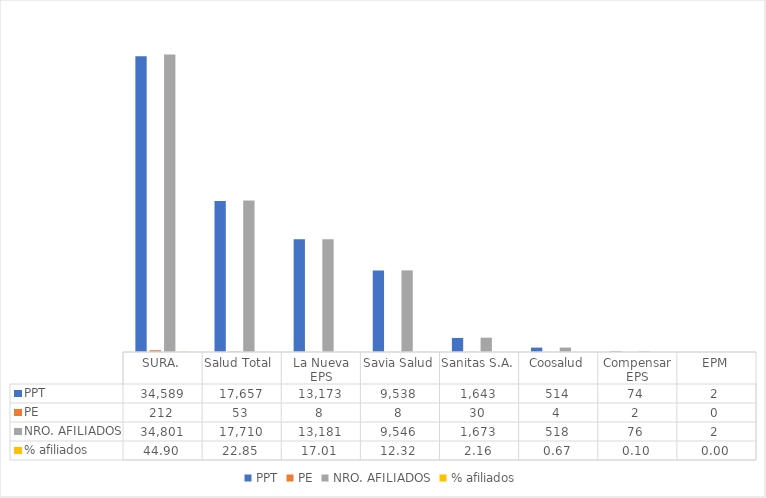
| Category | PPT | PE | NRO. AFILIADOS | % afiliados |
|---|---|---|---|---|
| SURA. | 34589 | 212 | 34801 | 44.9 |
| Salud Total  | 17657 | 53 | 17710 | 22.85 |
| La Nueva EPS | 13173 | 8 | 13181 | 17.006 |
| Savia Salud | 9538 | 8 | 9546 | 12.316 |
| Sanitas S.A. | 1643 | 30 | 1673 | 2.159 |
| Coosalud | 514 | 4 | 518 | 0.668 |
| Compensar EPS | 74 | 2 | 76 | 0.098 |
| EPM | 2 | 0 | 2 | 0.003 |